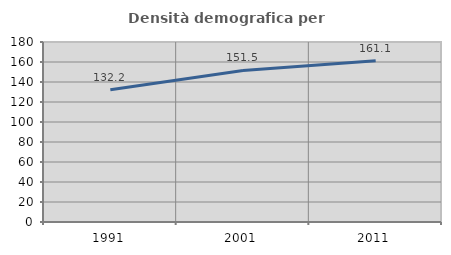
| Category | Densità demografica |
|---|---|
| 1991.0 | 132.155 |
| 2001.0 | 151.544 |
| 2011.0 | 161.138 |